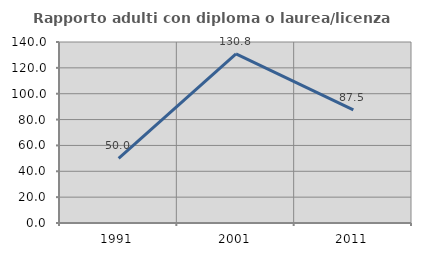
| Category | Rapporto adulti con diploma o laurea/licenza media  |
|---|---|
| 1991.0 | 50 |
| 2001.0 | 130.769 |
| 2011.0 | 87.5 |